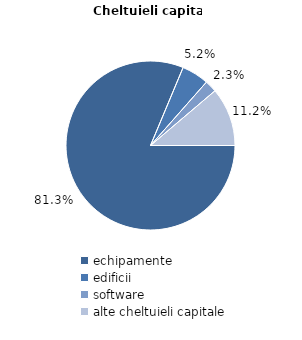
| Category | Series 0 |
|---|---|
| echipamente | 81.3 |
| edificii | 5.2 |
| software | 2.3 |
| alte cheltuieli capitale | 11.2 |